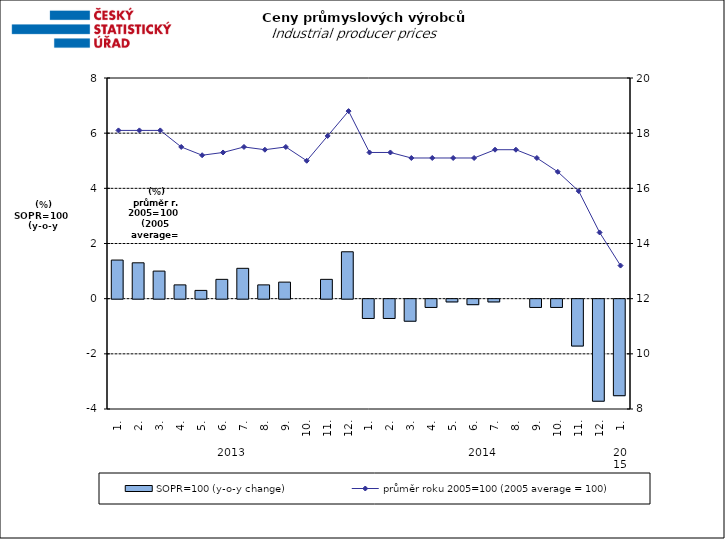
| Category | SOPR=100 (y-o-y change)   |
|---|---|
| 0 | 1.4 |
| 1 | 1.3 |
| 2 | 1 |
| 3 | 0.5 |
| 4 | 0.3 |
| 5 | 0.7 |
| 6 | 1.1 |
| 7 | 0.5 |
| 8 | 0.6 |
| 9 | 0 |
| 10 | 0.7 |
| 11 | 1.7 |
| 12 | -0.7 |
| 13 | -0.7 |
| 14 | -0.8 |
| 15 | -0.3 |
| 16 | -0.1 |
| 17 | -0.2 |
| 18 | -0.1 |
| 19 | 0 |
| 20 | -0.3 |
| 21 | -0.3 |
| 22 | -1.7 |
| 23 | -3.7 |
| 24 | -3.5 |